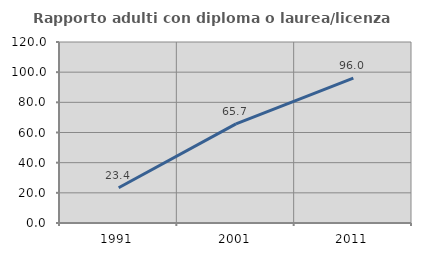
| Category | Rapporto adulti con diploma o laurea/licenza media  |
|---|---|
| 1991.0 | 23.364 |
| 2001.0 | 65.714 |
| 2011.0 | 96.032 |